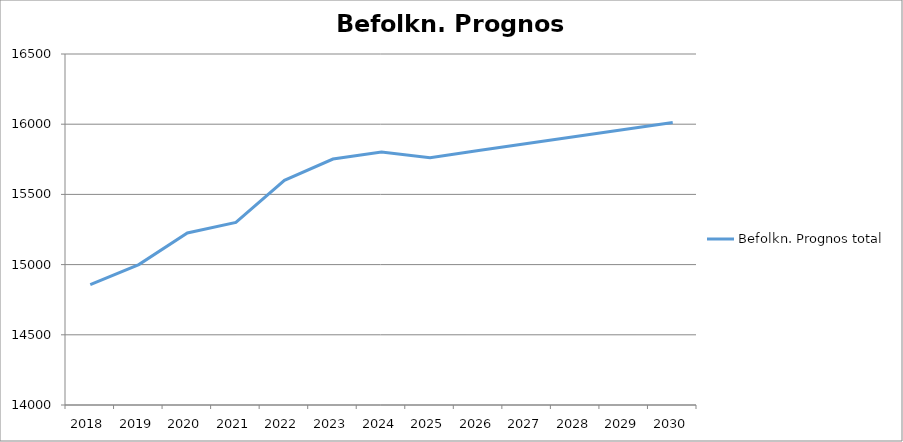
| Category | Befolkn. Prognos total |
|---|---|
| 2018.0 | 14858 |
| 2019.0 | 15000 |
| 2020.0 | 15225 |
| 2021.0 | 15300 |
| 2022.0 | 15600 |
| 2023.0 | 15752 |
| 2024.0 | 15802 |
| 2025.0 | 15762 |
| 2026.0 | 15812 |
| 2027.0 | 15862 |
| 2028.0 | 15912 |
| 2029.0 | 15962 |
| 2030.0 | 16012 |